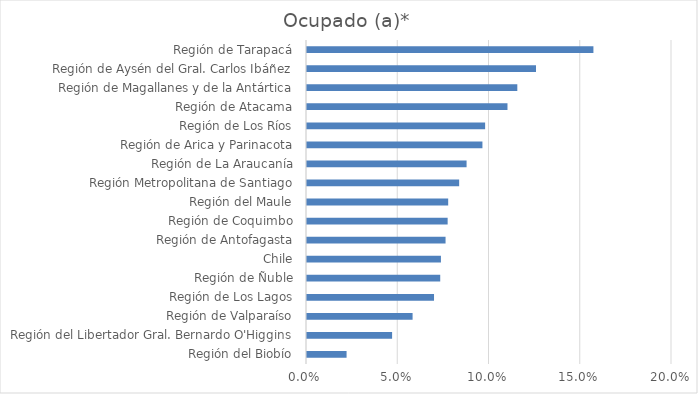
| Category | Ocupado (a)* |
|---|---|
| Región del Biobío | 0.022 |
| Región del Libertador Gral. Bernardo O'Higgins | 0.047 |
| Región de Valparaíso | 0.058 |
| Región de Los Lagos | 0.07 |
| Región de Ñuble | 0.073 |
| Chile | 0.073 |
| Región de Antofagasta | 0.076 |
| Región de Coquimbo | 0.077 |
| Región del Maule | 0.077 |
| Región Metropolitana de Santiago | 0.083 |
| Región de La Araucanía | 0.087 |
| Región de Arica y Parinacota | 0.096 |
| Región de Los Ríos | 0.098 |
| Región de Atacama | 0.11 |
| Región de Magallanes y de la Antártica | 0.115 |
| Región de Aysén del Gral. Carlos Ibáñez | 0.125 |
| Región de Tarapacá | 0.157 |